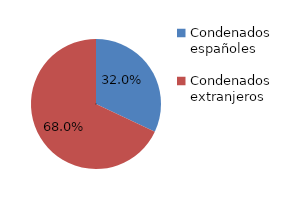
| Category | Series 0 |
|---|---|
| Condenados españoles | 48 |
| Condenados extranjeros | 102 |
| Condenados Personas Jurídicas | 0 |